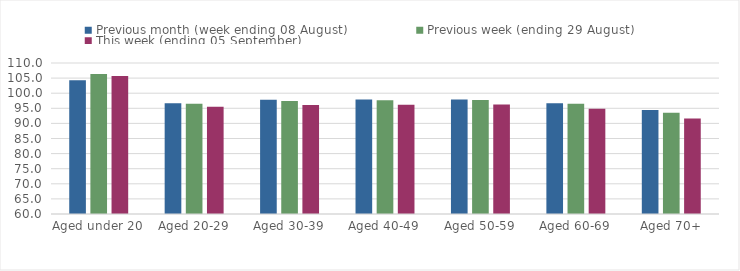
| Category | Previous month (week ending 08 August) | Previous week (ending 29 August) | This week (ending 05 September) |
|---|---|---|---|
| Aged under 20 | 104.25 | 106.35 | 105.69 |
| Aged 20-29 | 96.67 | 96.48 | 95.55 |
| Aged 30-39 | 97.81 | 97.42 | 96.06 |
| Aged 40-49 | 97.92 | 97.69 | 96.15 |
| Aged 50-59 | 97.94 | 97.72 | 96.29 |
| Aged 60-69 | 96.7 | 96.52 | 94.85 |
| Aged 70+ | 94.4 | 93.54 | 91.59 |